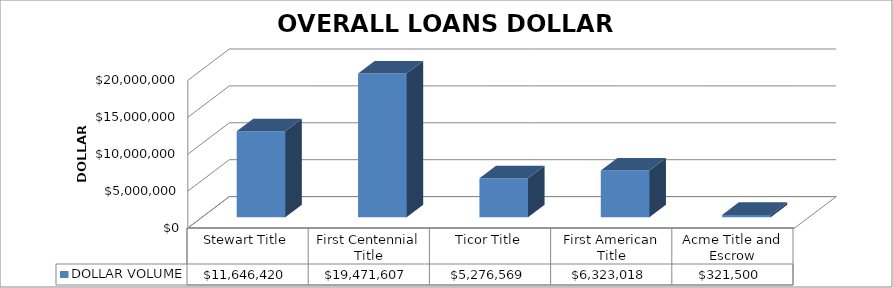
| Category | DOLLAR VOLUME |
|---|---|
| Stewart Title | 11646420 |
| First Centennial Title | 19471607 |
| Ticor Title | 5276569 |
| First American Title | 6323017.5 |
| Acme Title and Escrow | 321500 |